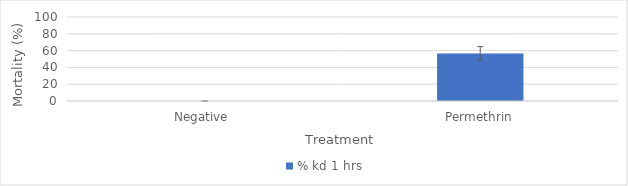
| Category | % kd 1 hrs |
|---|---|
| Negative  | 0 |
| Permethrin | 56.481 |